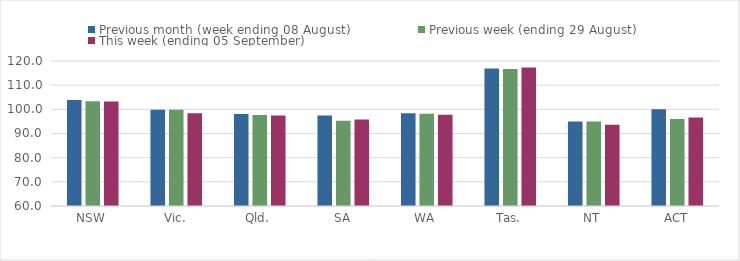
| Category | Previous month (week ending 08 August) | Previous week (ending 29 August) | This week (ending 05 September) |
|---|---|---|---|
| NSW | 103.82 | 103.37 | 103.26 |
| Vic. | 99.87 | 99.83 | 98.36 |
| Qld. | 98.09 | 97.61 | 97.45 |
| SA | 97.44 | 95.27 | 95.75 |
| WA | 98.33 | 98.13 | 97.78 |
| Tas. | 116.91 | 116.67 | 117.29 |
| NT | 94.92 | 95 | 93.67 |
| ACT | 100 | 96.05 | 96.63 |